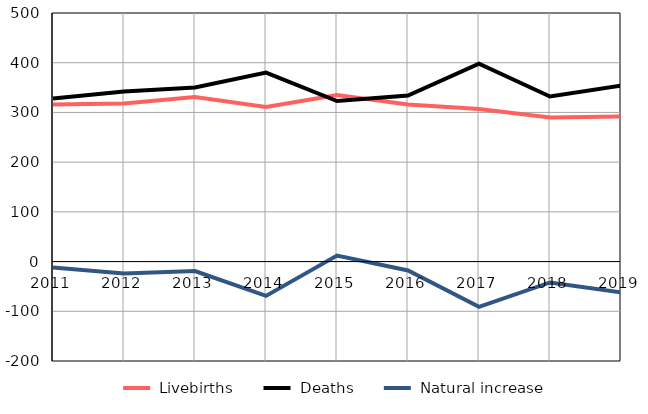
| Category |  Livebirths |  Deaths |  Natural increase |
|---|---|---|---|
| 2011.0 | 316 | 328 | -12 |
| 2012.0 | 318 | 342 | -24 |
| 2013.0 | 331 | 350 | -19 |
| 2014.0 | 311 | 380 | -69 |
| 2015.0 | 335 | 323 | 12 |
| 2016.0 | 316 | 334 | -18 |
| 2017.0 | 307 | 398 | -91 |
| 2018.0 | 290 | 332 | -42 |
| 2019.0 | 292 | 354 | -62 |